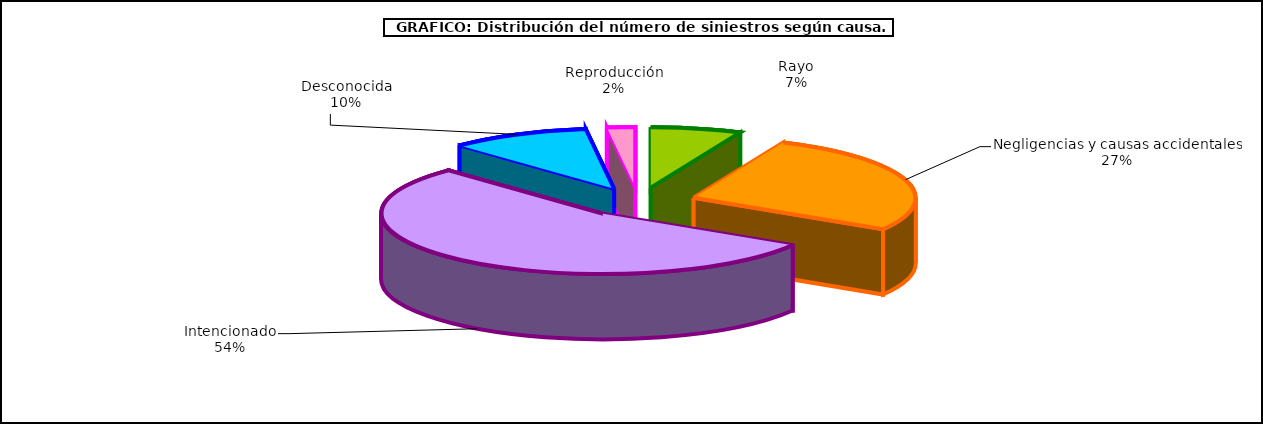
| Category | Series 0 |
|---|---|
| Rayo | 779 |
| Negligencias y causas accidentales | 3205 |
| Intencionado | 6380 |
| Desconocida | 1205 |
| Reproducción | 241 |